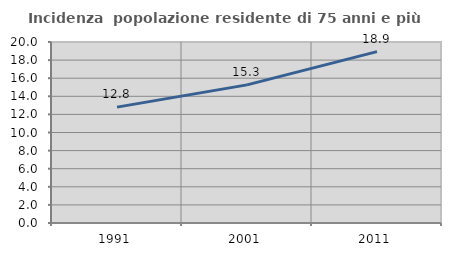
| Category | Incidenza  popolazione residente di 75 anni e più |
|---|---|
| 1991.0 | 12.804 |
| 2001.0 | 15.261 |
| 2011.0 | 18.932 |